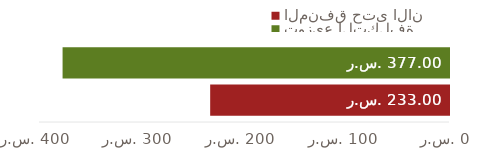
| Category | المنفق حتى الآن | توزيع التكلفة |
|---|---|---|
| الإجماليات | 233 | 377 |